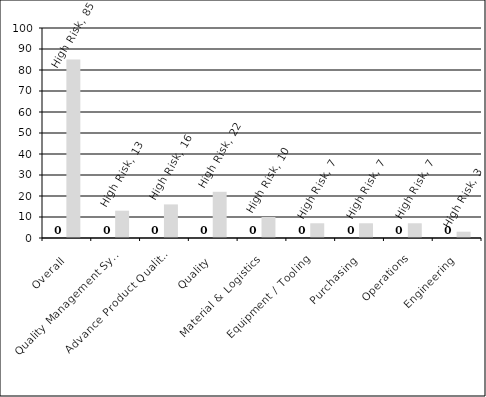
| Category | Series 0 | High Risk |
|---|---|---|
| Overall | 0 | 85 |
| Quality Management System | 0 | 13 |
| Advance Product Quality Planning | 0 | 16 |
| Quality | 0 | 22 |
| Material & Logistics | 0 | 10 |
| Equipment / Tooling | 0 | 7 |
| Purchasing | 0 | 7 |
| Operations | 0 | 7 |
| Engineering | 0 | 3 |